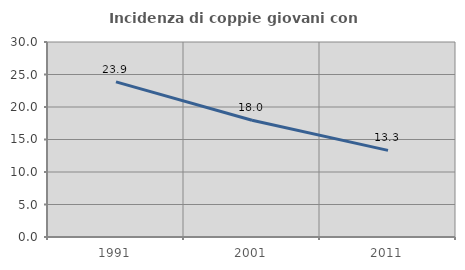
| Category | Incidenza di coppie giovani con figli |
|---|---|
| 1991.0 | 23.867 |
| 2001.0 | 17.961 |
| 2011.0 | 13.328 |